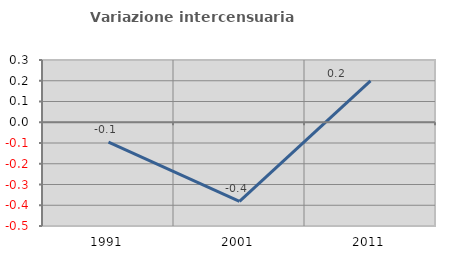
| Category | Variazione intercensuaria annua |
|---|---|
| 1991.0 | -0.096 |
| 2001.0 | -0.382 |
| 2011.0 | 0.199 |